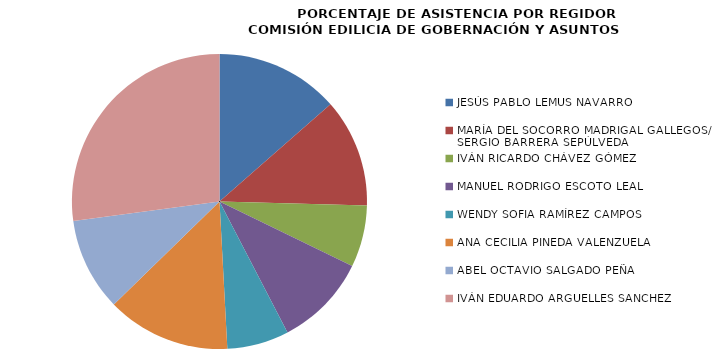
| Category | Series 0 |
|---|---|
| JESÚS PABLO LEMUS NAVARRO | 100 |
| MARÍA DEL SOCORRO MADRIGAL GALLEGOS/
SERGIO BARRERA SEPÚLVEDA | 87.5 |
| IVÁN RICARDO CHÁVEZ GÓMEZ | 50 |
| MANUEL RODRIGO ESCOTO LEAL  | 75 |
| WENDY SOFIA RAMÍREZ CAMPOS | 50 |
| ANA CECILIA PINEDA VALENZUELA | 100 |
| ABEL OCTAVIO SALGADO PEÑA | 75 |
| IVÁN EDUARDO ARGUELLES SANCHEZ | 200 |